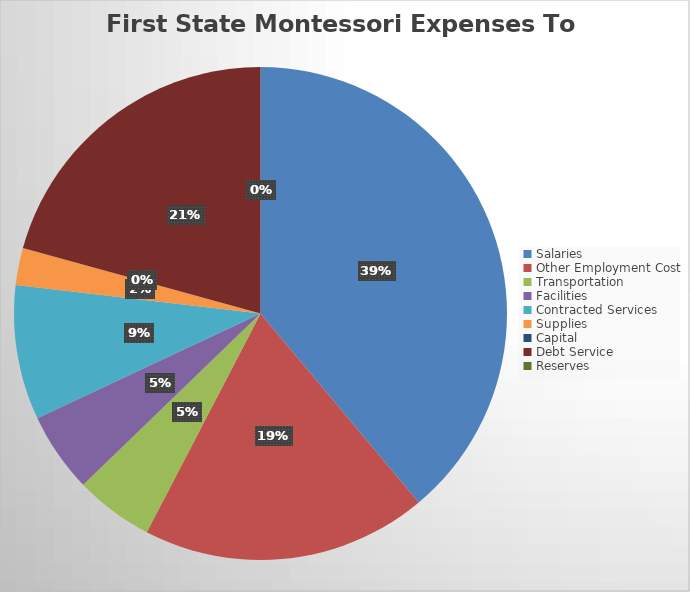
| Category | Series 0 |
|---|---|
| Salaries | 1451922.43 |
| Other Employment Cost | 698750.06 |
| Transportation | 192242.77 |
| Facilities | 195081.68 |
| Contracted Services | 329595.68 |
| Supplies | 91073.42 |
| Capital | 0 |
| Debt Service | 773103.4 |
| Reserves | 0 |